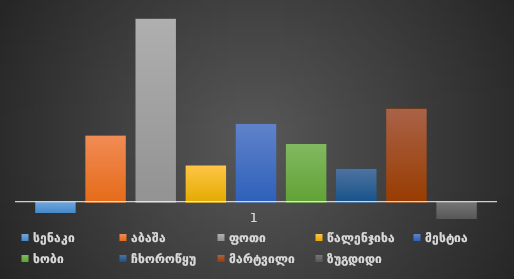
| Category | სენაკი | აბაშა | ფოთი | წალენჯიხა | მესტია | ხობი | ჩხოროწყუ | მარტვილი | ზუგდიდი |
|---|---|---|---|---|---|---|---|---|---|
| 0 | -9600 | 61200 | 169200 | 33600 | 72000 | 53400 | 30600 | 86160 | -15000 |